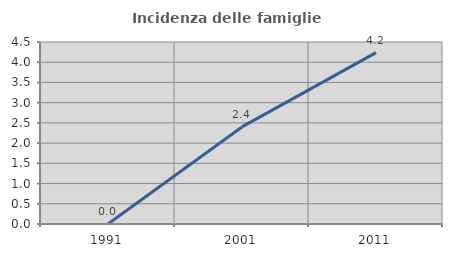
| Category | Incidenza delle famiglie numerose |
|---|---|
| 1991.0 | 0 |
| 2001.0 | 2.4 |
| 2011.0 | 4.237 |